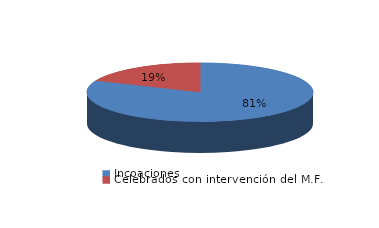
| Category | Series 0 |
|---|---|
| Incoaciones | 12741 |
| Celebrados con intervención del M.F. | 2908 |